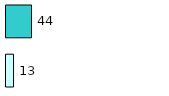
| Category | Series 0 | Series 1 |
|---|---|---|
| 0 | 13 | 44 |